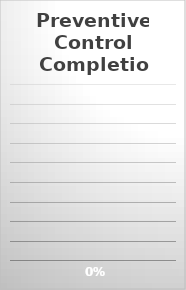
| Category | Series 0 |
|---|---|
| Preventive Controls Implemented: | 0 |